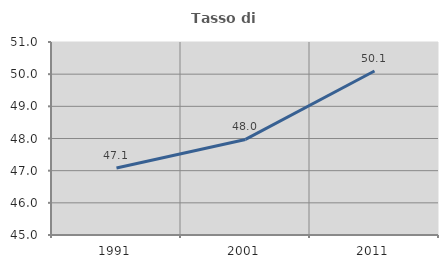
| Category | Tasso di occupazione   |
|---|---|
| 1991.0 | 47.083 |
| 2001.0 | 47.972 |
| 2011.0 | 50.098 |